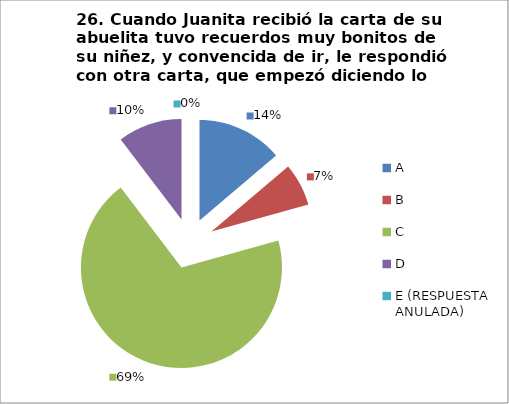
| Category | CANTIDAD DE RESPUESTAS PREGUNTA (23) | PORCENTAJE |
|---|---|---|
| A | 4 | 0.138 |
| B | 2 | 0.069 |
| C | 20 | 0.69 |
| D | 3 | 0.103 |
| E (RESPUESTA ANULADA) | 0 | 0 |